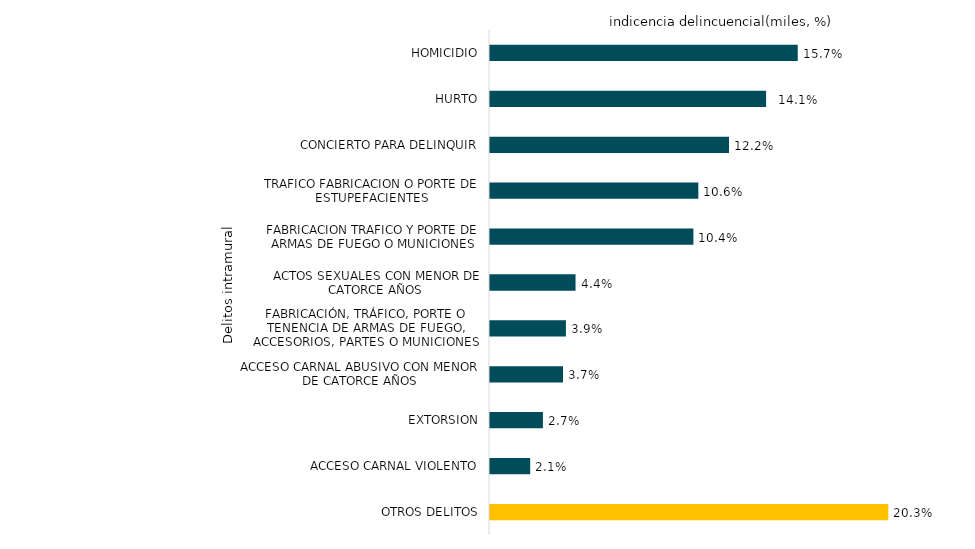
| Category | Total |
|---|---|
| HOMICIDIO | 26080 |
| HURTO | 23399 |
| CONCIERTO PARA DELINQUIR | 20254 |
| TRAFICO FABRICACION O PORTE DE ESTUPEFACIENTES | 17654 |
| FABRICACION TRAFICO Y PORTE DE ARMAS DE FUEGO O MUNICIONES | 17237 |
| ACTOS SEXUALES CON MENOR DE CATORCE AÑOS | 7250 |
| FABRICACIÓN, TRÁFICO, PORTE O TENENCIA DE ARMAS DE FUEGO, ACCESORIOS, PARTES O MUNICIONES | 6434 |
| ACCESO CARNAL ABUSIVO CON MENOR DE CATORCE AÑOS | 6189 |
| EXTORSION | 4483 |
| ACCESO CARNAL VIOLENTO | 3407 |
| OTROS DELITOS | 33756 |